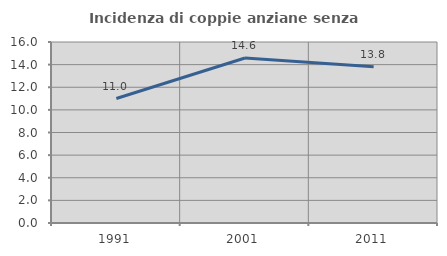
| Category | Incidenza di coppie anziane senza figli  |
|---|---|
| 1991.0 | 11.003 |
| 2001.0 | 14.583 |
| 2011.0 | 13.811 |